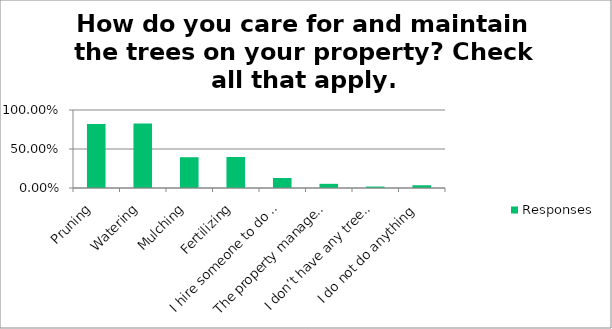
| Category | Responses |
|---|---|
| Pruning | 0.82 |
| Watering | 0.826 |
| Mulching | 0.394 |
| Fertilizing | 0.398 |
| I hire someone to do this | 0.128 |
| The property manager does this | 0.053 |
| I don’t have any trees on my property | 0.018 |
| I do not do anything | 0.035 |